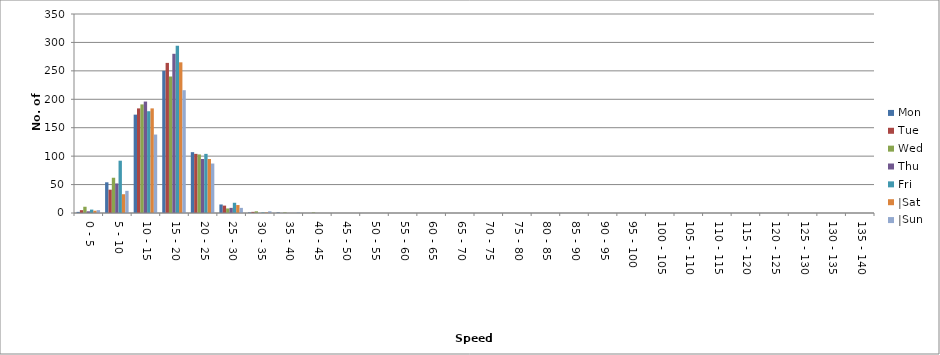
| Category | Mon | Tue | Wed | Thu | Fri | |Sat | |Sun |
|---|---|---|---|---|---|---|---|
| 0 - 5 | 2 | 5 | 11 | 3 | 6 | 4 | 5 |
| 5 - 10 | 54 | 41 | 62 | 52 | 92 | 33 | 39 |
| 10 - 15 | 173 | 184 | 191 | 196 | 179 | 184 | 138 |
| 15 - 20 | 250 | 264 | 240 | 280 | 294 | 265 | 216 |
| 20 - 25 | 107 | 104 | 103 | 95 | 104 | 95 | 87 |
| 25 - 30 | 15 | 13 | 8 | 9 | 18 | 14 | 9 |
| 30 - 35 | 1 | 2 | 3 | 0 | 1 | 1 | 3 |
| 35 - 40 | 1 | 0 | 1 | 0 | 0 | 0 | 1 |
| 40 - 45 | 0 | 0 | 1 | 0 | 0 | 0 | 0 |
| 45 - 50 | 0 | 0 | 0 | 0 | 0 | 0 | 0 |
| 50 - 55 | 0 | 0 | 0 | 0 | 0 | 0 | 0 |
| 55 - 60 | 0 | 0 | 0 | 0 | 0 | 0 | 0 |
| 60 - 65 | 0 | 0 | 0 | 0 | 0 | 0 | 0 |
| 65 - 70 | 0 | 0 | 0 | 0 | 0 | 0 | 0 |
| 70 - 75 | 0 | 0 | 0 | 0 | 0 | 0 | 0 |
| 75 - 80 | 0 | 0 | 0 | 0 | 0 | 0 | 0 |
| 80 - 85 | 0 | 0 | 0 | 0 | 0 | 0 | 0 |
| 85 - 90 | 0 | 0 | 0 | 0 | 0 | 0 | 0 |
| 90 - 95 | 0 | 0 | 0 | 0 | 0 | 0 | 0 |
| 95 - 100 | 0 | 0 | 0 | 0 | 0 | 0 | 0 |
| 100 - 105 | 0 | 0 | 0 | 0 | 0 | 0 | 0 |
| 105 - 110 | 0 | 0 | 0 | 0 | 0 | 0 | 0 |
| 110 - 115 | 0 | 0 | 0 | 0 | 0 | 0 | 0 |
| 115 - 120 | 0 | 0 | 0 | 0 | 0 | 0 | 0 |
| 120 - 125 | 0 | 0 | 0 | 0 | 0 | 0 | 0 |
| 125 - 130 | 0 | 0 | 0 | 0 | 0 | 0 | 0 |
| 130 - 135 | 0 | 0 | 0 | 0 | 0 | 0 | 0 |
| 135 - 140 | 0 | 0 | 0 | 0 | 0 | 0 | 0 |